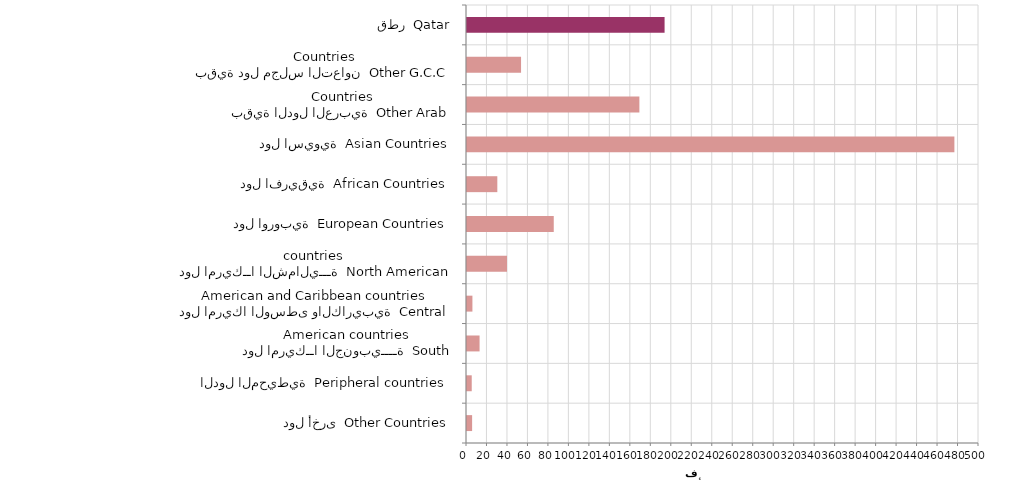
| Category | Series 0 |
|---|---|
| دول أخرى  Other Countries | 4991 |
| الدول المحيطية  Peripheral countries | 4626 |
| دول امريكــا الجنوبيــــة  South American countries | 12274 |
| دول امريكا الوسطى والكاريبية  Central American and Caribbean countries | 5296 |
| دول امريكــا الشماليـــة  North American countries  | 39068 |
| دول اوروبية  European Countries | 84724 |
| دول افريقية  African Countries | 29608 |
| دول اسيوية  Asian Countries | 475971 |
| بقية الدول العربية  Other Arab Countries | 168344 |
| بقية دول مجلس التعاون  Other G.C.C Countries | 52785 |
| قطر  Qatar | 192953 |